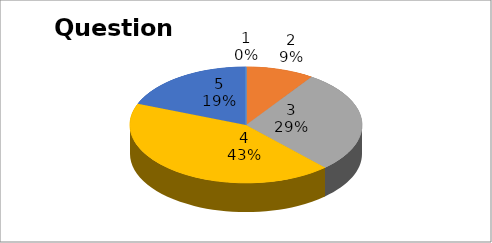
| Category | Series 0 |
|---|---|
| 0 | 0 |
| 1 | 2 |
| 2 | 6 |
| 3 | 9 |
| 4 | 4 |